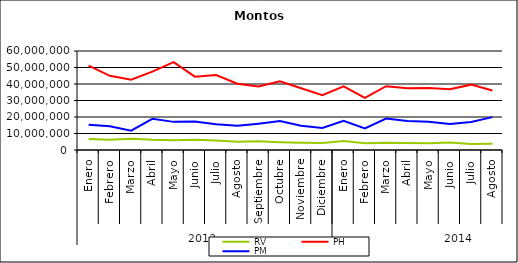
| Category | RV | PH | PM |
|---|---|---|---|
| 0 | 6603412.357 | 51097257.501 | 15291994.497 |
| 1 | 6144371.716 | 44938482.89 | 14418861.164 |
| 2 | 6870539.137 | 42574717.992 | 11735480.075 |
| 3 | 6139858.354 | 47535968.024 | 18924825.739 |
| 4 | 5890476.617 | 53273527.932 | 17047621.863 |
| 5 | 6142686.449 | 44450017.2 | 17254269.094 |
| 6 | 5792277.798 | 45481930.674 | 15546714.502 |
| 7 | 4962192.427 | 40196203.529 | 14644148.591 |
| 8 | 5244267.415 | 38549056.812 | 15946518.356 |
| 9 | 4723321.466 | 41614732.22 | 17536811.707 |
| 10 | 4437368.656 | 37439358.84 | 14761398.421 |
| 11 | 4226608.984 | 33178083.97 | 13384599.022 |
| 12 | 5420667.417 | 38592535.269 | 17738595.757 |
| 13 | 4106438.771 | 31549668.118 | 13082413.394 |
| 14 | 4333641.03 | 38643419.598 | 19107804.717 |
| 15 | 4275572.01 | 37358737.373 | 17555594.298 |
| 16 | 4139390.073 | 37637742.383 | 17146834.395 |
| 17 | 4553837.188 | 36763239.571 | 15771052.834 |
| 18 | 3703149.165 | 39606057.082 | 16994946.064 |
| 19 | 3782918.817 | 36051238.49 | 19934925.294 |